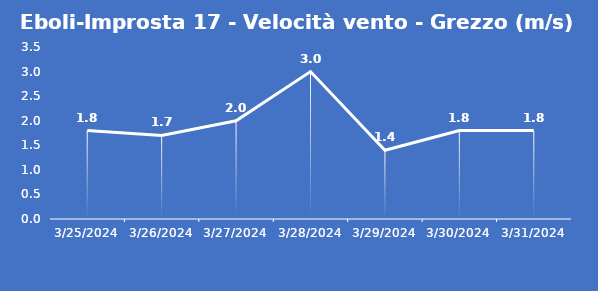
| Category | Eboli-Improsta 17 - Velocità vento - Grezzo (m/s) |
|---|---|
| 3/25/24 | 1.8 |
| 3/26/24 | 1.7 |
| 3/27/24 | 2 |
| 3/28/24 | 3 |
| 3/29/24 | 1.4 |
| 3/30/24 | 1.8 |
| 3/31/24 | 1.8 |